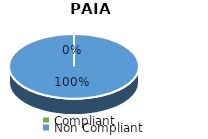
| Category | Series 7 | Series 6 | Series 5 | Series 4 | Series 3 | Series 2 | Series 1 | Series 0 |
|---|---|---|---|---|---|---|---|---|
| Compliant | 0 | 0 | 0 | 0 | 0 | 0 | 0 | 0 |
| Non Compliant | 13 | 13 | 8 | 4 | 4 | 8 | 9 | 10 |